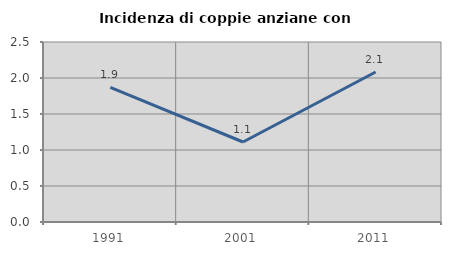
| Category | Incidenza di coppie anziane con figli |
|---|---|
| 1991.0 | 1.869 |
| 2001.0 | 1.111 |
| 2011.0 | 2.083 |